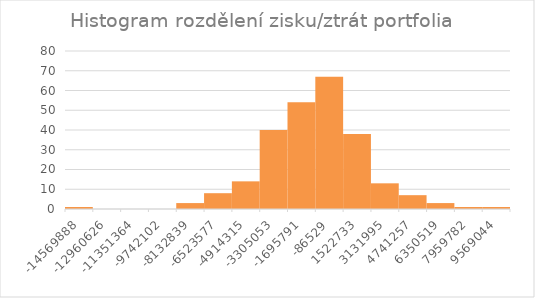
| Category | Series 0 |
|---|---|
| -14569887.806167275 | 1 |
| -12960625.709543128 | 0 |
| -11351363.61291898 | 0 |
| -9742101.516294833 | 0 |
| -8132839.419670687 | 3 |
| -6523577.323046541 | 8 |
| -4914315.226422395 | 14 |
| -3305053.1297982484 | 40 |
| -1695791.0331741022 | 54 |
| -86528.93654995598 | 67 |
| 1522733.1600741902 | 38 |
| 3131995.2566983365 | 13 |
| 4741257.353322483 | 7 |
| 6350519.449946629 | 3 |
| 7959781.546570775 | 1 |
| 9569043.643194921 | 1 |